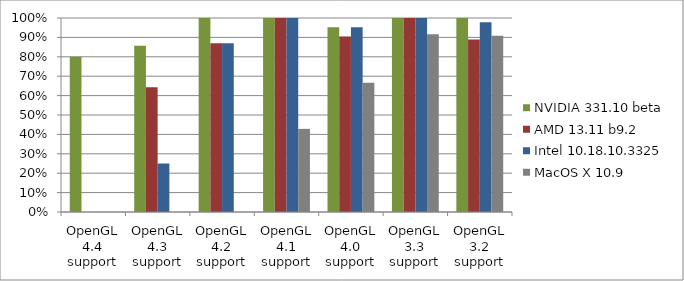
| Category | NVIDIA 331.10 beta | AMD 13.11 b9.2 | Intel 10.18.10.3325 | MacOS X 10.9 |
|---|---|---|---|---|
| OpenGL 4.4 support | 0.8 | 0 | 0 | 0 |
| OpenGL 4.3 support | 0.857 | 0.643 | 0.25 | 0 |
| OpenGL 4.2 support | 1 | 0.87 | 0.87 | 0 |
| OpenGL 4.1 support | 1 | 1 | 1 | 0.429 |
| OpenGL 4.0 support | 0.952 | 0.905 | 0.952 | 0.667 |
| OpenGL 3.3 support | 1 | 1 | 1 | 0.917 |
| OpenGL 3.2 support | 1 | 0.889 | 0.978 | 0.909 |